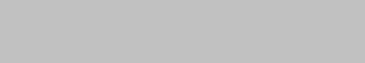
| Category | 1 | 2 | 3 | 4 | 5 | 6 |
|---|---|---|---|---|---|---|
|  | 0 | 0 | 0 | 0 | 0 | 0 |
|  | 0 | 0 | 0 | 0 | 0 | 0 |
|  | 0 | 0 | 0 | 0 | 0 | 0 |
|  | 0 | 0 | 0 | 0 | 0 | 0 |
| 0 | 0 | 0 | 0 | 0 | 0 | 0 |